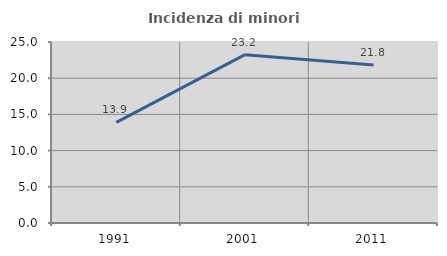
| Category | Incidenza di minori stranieri |
|---|---|
| 1991.0 | 13.889 |
| 2001.0 | 23.247 |
| 2011.0 | 21.818 |